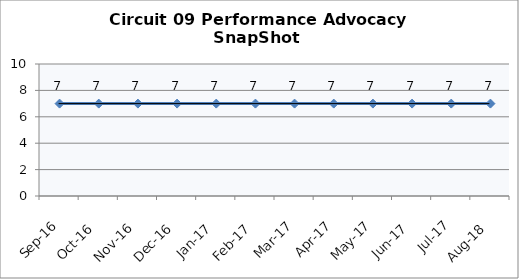
| Category | Circuit 09 |
|---|---|
| Sep-16 | 7 |
| Oct-16 | 7 |
| Nov-16 | 7 |
| Dec-16 | 7 |
| Jan-17 | 7 |
| Feb-17 | 7 |
| Mar-17 | 7 |
| Apr-17 | 7 |
| May-17 | 7 |
| Jun-17 | 7 |
| Jul-17 | 7 |
| Aug-18 | 7 |